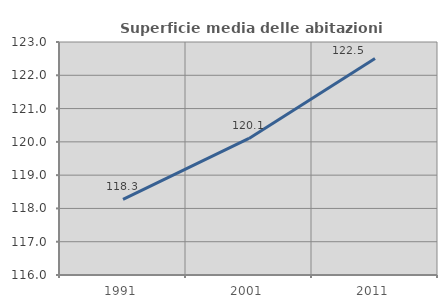
| Category | Superficie media delle abitazioni occupate |
|---|---|
| 1991.0 | 118.269 |
| 2001.0 | 120.103 |
| 2011.0 | 122.503 |